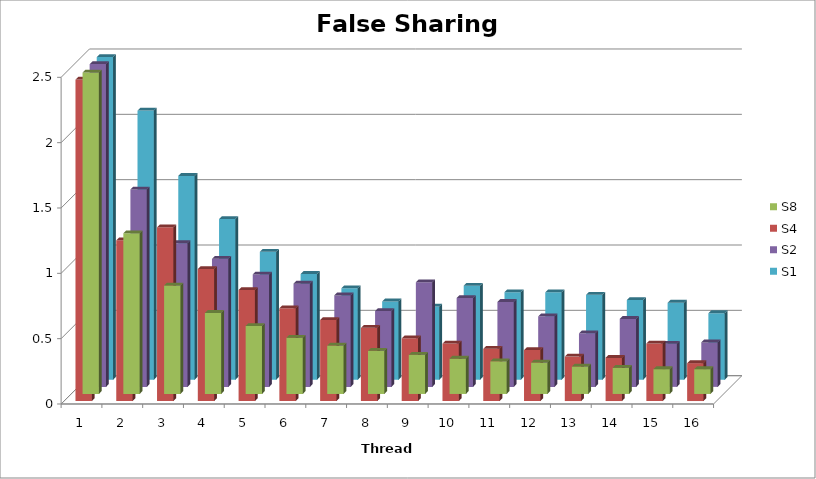
| Category | S8 | S4 | S2 | S1 |
|---|---|---|---|---|
| 0 | 2.46 | 2.46 | 2.47 | 2.47 |
| 1 | 1.23 | 1.23 | 1.51 | 2.06 |
| 2 | 0.83 | 1.33 | 1.1 | 1.56 |
| 3 | 0.62 | 1.01 | 0.98 | 1.23 |
| 4 | 0.52 | 0.85 | 0.86 | 0.98 |
| 5 | 0.43 | 0.71 | 0.79 | 0.81 |
| 6 | 0.37 | 0.62 | 0.7 | 0.7 |
| 7 | 0.33 | 0.56 | 0.58 | 0.6 |
| 8 | 0.3 | 0.48 | 0.8 | 0.56 |
| 9 | 0.27 | 0.44 | 0.68 | 0.72 |
| 10 | 0.25 | 0.4 | 0.65 | 0.67 |
| 11 | 0.24 | 0.39 | 0.54 | 0.67 |
| 12 | 0.21 | 0.34 | 0.41 | 0.65 |
| 13 | 0.2 | 0.33 | 0.52 | 0.61 |
| 14 | 0.19 | 0.44 | 0.33 | 0.59 |
| 15 | 0.19 | 0.29 | 0.34 | 0.51 |